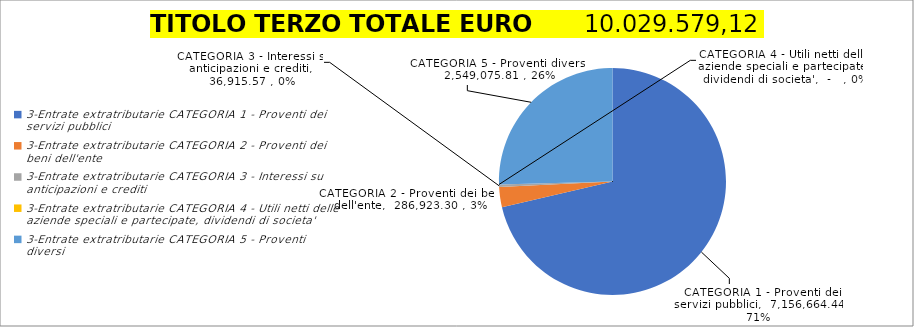
| Category | Series 0 |
|---|---|
| 0 | 7156664.44 |
| 1 | 286923.3 |
| 2 | 36915.57 |
| 3 | 0 |
| 4 | 2549075.81 |